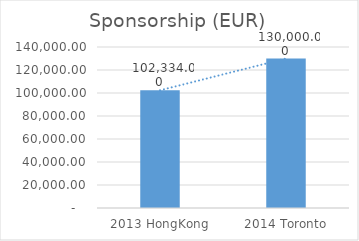
| Category | Sponsorship |
|---|---|
| 2013 HongKong | 102334 |
| 2014 Toronto | 130000 |